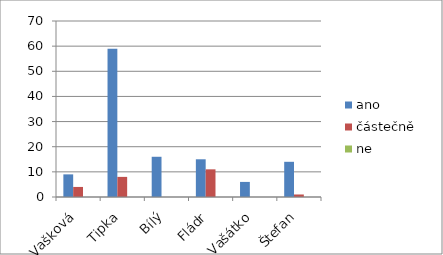
| Category | ano   | částečně   | ne |
|---|---|---|---|
| Vašková | 9 | 4 | 0 |
| Tipka | 59 | 8 | 0 |
| Bílý | 16 | 0 | 0 |
| Fládr | 15 | 11 | 0 |
| Vašátko | 6 | 0 | 0 |
| Štefan | 14 | 1 | 0 |